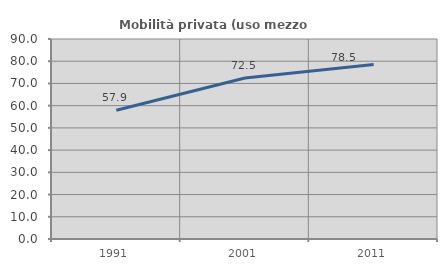
| Category | Mobilità privata (uso mezzo privato) |
|---|---|
| 1991.0 | 57.941 |
| 2001.0 | 72.481 |
| 2011.0 | 78.496 |